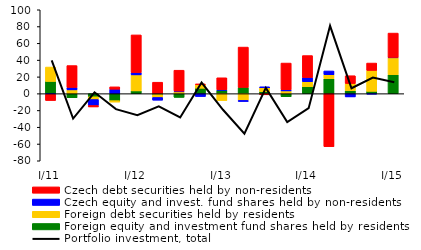
| Category | Foreign equity and investment fund shares held by residents | Foreign debt securities held by residents  | Czech equity and invest. fund shares held by non-residents  | Czech debt securities held by non-residents  |
|---|---|---|---|---|
| I/11 | 14.567 | 17.185 | -0.812 | -7.345 |
| II | -4.896 | 4.506 | 2.914 | 26.084 |
| III | -3.713 | -3.275 | -7.125 | -1.717 |
| IV | -8.33 | -1.701 | 5.325 | 2.798 |
| I/12 | 3.306 | 19.066 | 2.798 | 44.867 |
| II | -1.1 | -3.438 | -3.249 | 13.669 |
| III | -4.429 | 2.169 | 0.915 | 24.887 |
| IV | 6.453 | 4.343 | -3.402 | 0.733 |
| I/13 | 4.078 | -8.168 | 0.714 | 14.146 |
| II | 7.436 | -8.051 | -1.279 | 48.104 |
| III | 2.417 | 4.579 | 1.224 | -1.376 |
| IV | -3.652 | 3.278 | 1.402 | 31.82 |
| I/14 | 8.294 | 5.918 | 5.024 | 26.183 |
| II | 17.782 | 4.744 | 4.546 | -63.167 |
| III | 3.481 | 8.634 | -3.872 | 9.272 |
| IV | 2.772 | 24.934 | -0.485 | 8.788 |
| I/15 | 22.663 | 20.346 | 0.202 | 29.014 |